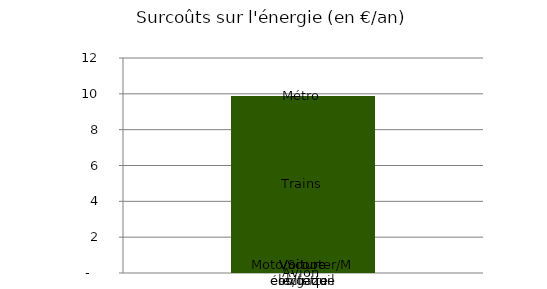
| Category | Voiture ess/gazoil | Voiture gaz (GPL) | Voiture électrique | Moto/Scooter/Mobilette | Avion | Trains | Bus | Métro |
|---|---|---|---|---|---|---|---|---|
| surcoûts en € | 0 | 0 | 0 | 0 | 0 | 9.88 | 0 | 0 |